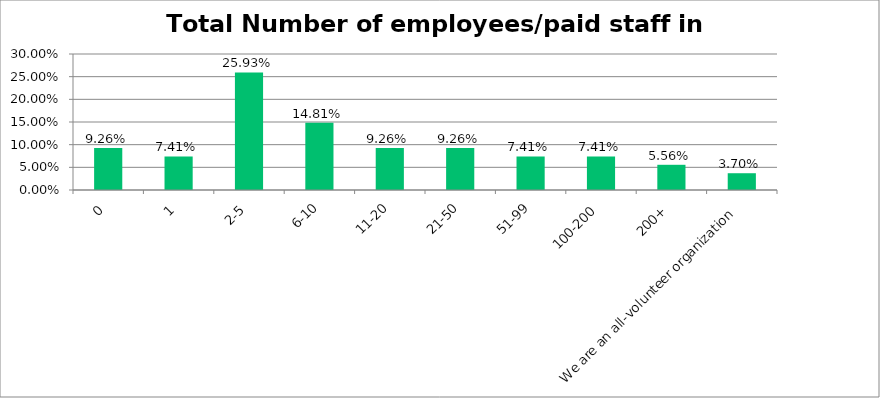
| Category | Responses |
|---|---|
| 0 | 0.093 |
| 1 | 0.074 |
| 2-5 | 0.259 |
| 6-10 | 0.148 |
| 11-20 | 0.093 |
| 21-50 | 0.093 |
| 51-99 | 0.074 |
| 100-200 | 0.074 |
| 200+ | 0.056 |
| We are an all-volunteer organization | 0.037 |